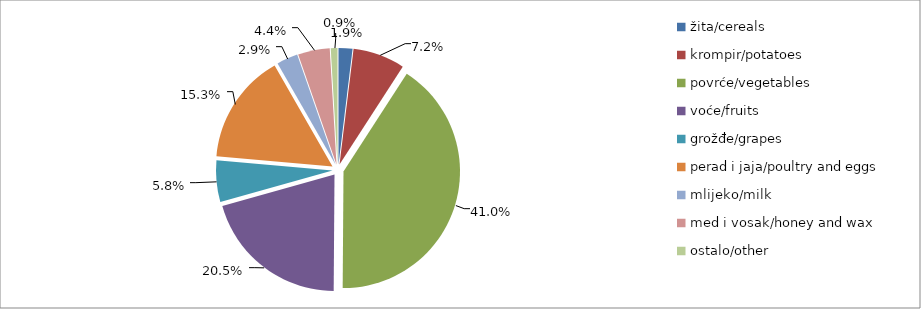
| Category | Series 0 |
|---|---|
| žita/cereals | 41304 |
| krompir/potatoes | 153947 |
| povrće/vegetables | 876132.5 |
| voće/fruits | 439090 |
| grožđe/grapes | 122973 |
| perad i jaja/poultry and eggs | 327543 |
| mlijeko/milk | 62929 |
| med i vosak/honey and wax | 94219 |
| ostalo/other | 19860 |